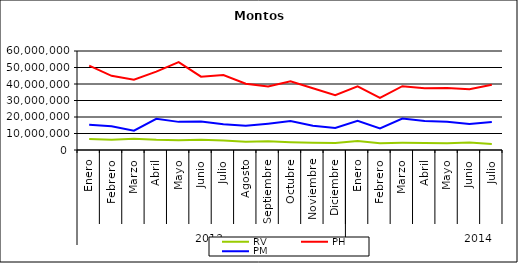
| Category | RV | PH | PM |
|---|---|---|---|
| 0 | 6603412.357 | 51097257.501 | 15291994.497 |
| 1 | 6144371.716 | 44938482.89 | 14418861.164 |
| 2 | 6870539.137 | 42574717.992 | 11735480.075 |
| 3 | 6139858.354 | 47535968.024 | 18924825.739 |
| 4 | 5890476.617 | 53273527.932 | 17047621.863 |
| 5 | 6142686.449 | 44450017.2 | 17254269.094 |
| 6 | 5792277.798 | 45481930.674 | 15546714.502 |
| 7 | 4962192.427 | 40196203.529 | 14644148.591 |
| 8 | 5244267.415 | 38549056.812 | 15946518.356 |
| 9 | 4723321.466 | 41614732.22 | 17536811.707 |
| 10 | 4437368.656 | 37439358.84 | 14761398.421 |
| 11 | 4226608.984 | 33178083.97 | 13384599.022 |
| 12 | 5420667.417 | 38592535.269 | 17738595.757 |
| 13 | 4106438.771 | 31549668.118 | 13082413.394 |
| 14 | 4333641.03 | 38643419.598 | 19107804.717 |
| 15 | 4275572.01 | 37358737.373 | 17555594.298 |
| 16 | 4139390.073 | 37637742.383 | 17146834.395 |
| 17 | 4553837.188 | 36763239.571 | 15771052.834 |
| 18 | 3703149.165 | 39606057.082 | 16994946.064 |